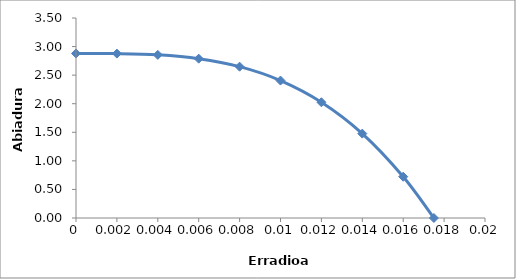
| Category | Series 0 |
|---|---|
| 0.0 | 2.88 |
| 0.002 | 2.877 |
| 0.004 | 2.855 |
| 0.006 | 2.788 |
| 0.008 | 2.648 |
| 0.01 | 2.405 |
| 0.012 | 2.026 |
| 0.014 | 1.477 |
| 0.016 | 0.722 |
| 0.0175 | 0 |